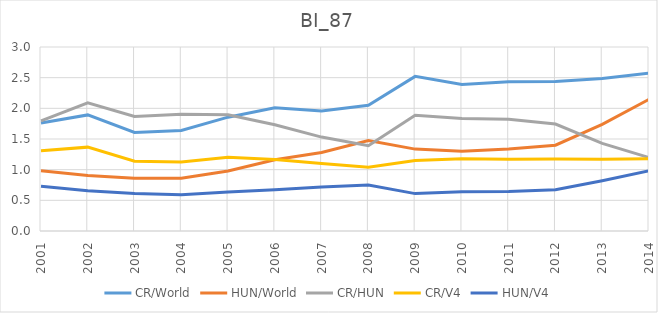
| Category | CR/World | HUN/World | CR/HUN | CR/V4 | HUN/V4 |
|---|---|---|---|---|---|
| 2001.0 | 1.762 | 0.982 | 1.794 | 1.308 | 0.729 |
| 2002.0 | 1.893 | 0.906 | 2.089 | 1.367 | 0.654 |
| 2003.0 | 1.606 | 0.86 | 1.866 | 1.138 | 0.61 |
| 2004.0 | 1.638 | 0.86 | 1.904 | 1.125 | 0.591 |
| 2005.0 | 1.856 | 0.979 | 1.896 | 1.202 | 0.634 |
| 2006.0 | 2.011 | 1.161 | 1.732 | 1.166 | 0.673 |
| 2007.0 | 1.958 | 1.279 | 1.531 | 1.099 | 0.718 |
| 2008.0 | 2.049 | 1.473 | 1.391 | 1.04 | 0.748 |
| 2009.0 | 2.521 | 1.335 | 1.888 | 1.151 | 0.61 |
| 2010.0 | 2.388 | 1.301 | 1.836 | 1.178 | 0.642 |
| 2011.0 | 2.432 | 1.336 | 1.821 | 1.171 | 0.643 |
| 2012.0 | 2.439 | 1.399 | 1.744 | 1.174 | 0.673 |
| 2013.0 | 2.485 | 1.739 | 1.428 | 1.17 | 0.819 |
| 2014.0 | 2.573 | 2.147 | 1.198 | 1.176 | 0.982 |